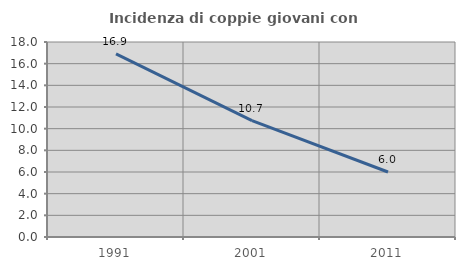
| Category | Incidenza di coppie giovani con figli |
|---|---|
| 1991.0 | 16.901 |
| 2001.0 | 10.748 |
| 2011.0 | 6 |